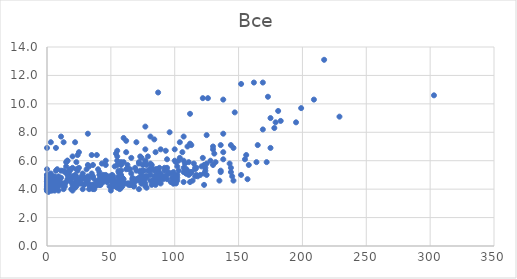
| Category | Цена, млн. £ |
|---|---|
| 172.0 | 5.9 |
| 158.0 | 5.7 |
| 157.0 | 4.7 |
| 152.0 | 5 |
| 146.0 | 4.6 |
| 145.0 | 4.9 |
| 144.0 | 5.5 |
| 136.0 | 5.3 |
| 135.0 | 4.6 |
| 125.0 | 5 |
| 124.0 | 5.3 |
| 123.0 | 4.3 |
| 123.0 | 5.1 |
| 112.0 | 4.5 |
| 99.0 | 4.4 |
| 88.0 | 4.9 |
| 73.0 | 4.6 |
| 72.0 | 4 |
| 67.0 | 4.7 |
| 64.0 | 4.4 |
| 59.0 | 4.2 |
| 57.0 | 4 |
| 53.0 | 4.5 |
| 52.0 | 4.4 |
| 47.0 | 4.5 |
| 36.0 | 4 |
| 33.0 | 4.3 |
| 19.0 | 4.8 |
| 11.0 | 4.8 |
| 10.0 | 4.5 |
| 9.0 | 4.2 |
| 9.0 | 4.3 |
| 8.0 | 4.7 |
| 7.0 | 4.7 |
| 5.0 | 4.2 |
| 4.0 | 4.2 |
| 3.0 | 4.8 |
| 1.0 | 4 |
| 0.0 | 5 |
| 0.0 | 4.7 |
| 0.0 | 4.4 |
| 0.0 | 4.2 |
| 0.0 | 4.2 |
| 0.0 | 4.1 |
| 0.0 | 4 |
| 0.0 | 4 |
| 0.0 | 4 |
| 0.0 | 4 |
| 0.0 | 4 |
| 0.0 | 4 |
| 0.0 | 4 |
| 0.0 | 4 |
| 0.0 | 4 |
| 0.0 | 4 |
| 0.0 | 4 |
| 0.0 | 4 |
| 0.0 | 4 |
| 0.0 | 3.9 |
| 0.0 | 3.9 |
| 0.0 | 3.9 |
| 0.0 | 3.9 |
| 0.0 | 3.9 |
| 175.0 | 6.9 |
| 165.0 | 7.1 |
| 156.0 | 6.4 |
| 146.0 | 6.9 |
| 143.0 | 5.8 |
| 138.0 | 6.1 |
| 138.0 | 6.6 |
| 132.0 | 5.9 |
| 131.0 | 6.5 |
| 130.0 | 5.7 |
| 123.0 | 5.7 |
| 118.0 | 4.9 |
| 117.0 | 5.5 |
| 116.0 | 4.9 |
| 116.0 | 5.5 |
| 115.0 | 5.8 |
| 114.0 | 4.6 |
| 113.0 | 5.2 |
| 112.0 | 5.1 |
| 111.0 | 5 |
| 110.0 | 5.3 |
| 109.0 | 5.4 |
| 108.0 | 5.8 |
| 107.0 | 4.5 |
| 107.0 | 6 |
| 103.0 | 5.3 |
| 102.0 | 4.6 |
| 102.0 | 4.8 |
| 102.0 | 5 |
| 101.0 | 4.6 |
| 101.0 | 4.6 |
| 100.0 | 4.6 |
| 100.0 | 5 |
| 100.0 | 6 |
| 99.0 | 4.4 |
| 97.0 | 4.5 |
| 95.0 | 5.2 |
| 94.0 | 4.7 |
| 90.0 | 4.9 |
| 90.0 | 4.9 |
| 89.0 | 4.4 |
| 89.0 | 5 |
| 88.0 | 4.5 |
| 87.0 | 4.8 |
| 87.0 | 5.4 |
| 86.0 | 4.5 |
| 86.0 | 5 |
| 85.0 | 4.5 |
| 85.0 | 4.7 |
| 84.0 | 4.5 |
| 83.0 | 4.4 |
| 83.0 | 4.6 |
| 82.0 | 5.7 |
| 81.0 | 4.6 |
| 81.0 | 5.3 |
| 81.0 | 5.4 |
| 79.0 | 5.3 |
| 78.0 | 4.1 |
| 78.0 | 4.9 |
| 78.0 | 5.7 |
| 77.0 | 4.2 |
| 77.0 | 5.9 |
| 77.0 | 6 |
| 76.0 | 4.6 |
| 74.0 | 4.4 |
| 74.0 | 5 |
| 74.0 | 6.2 |
| 72.0 | 4.8 |
| 71.0 | 4.7 |
| 70.0 | 4.7 |
| 70.0 | 5.3 |
| 68.0 | 4.2 |
| 68.0 | 4.4 |
| 67.0 | 4.8 |
| 66.0 | 4.3 |
| 65.0 | 4.3 |
| 65.0 | 4.4 |
| 64.0 | 4.3 |
| 63.0 | 4.4 |
| 61.0 | 4.4 |
| 60.0 | 4.4 |
| 60.0 | 4.7 |
| 60.0 | 5.9 |
| 59.0 | 4.8 |
| 58.0 | 4.1 |
| 58.0 | 4.5 |
| 58.0 | 5.9 |
| 57.0 | 4.1 |
| 57.0 | 4.7 |
| 56.0 | 4.3 |
| 56.0 | 4.8 |
| 56.0 | 5.2 |
| 55.0 | 4.1 |
| 55.0 | 4.3 |
| 55.0 | 6 |
| 52.0 | 4.2 |
| 52.0 | 4.3 |
| 51.0 | 4.5 |
| 50.0 | 3.9 |
| 50.0 | 4.7 |
| 50.0 | 4.7 |
| 49.0 | 4.2 |
| 48.0 | 4.8 |
| 47.0 | 4.9 |
| 43.0 | 5.8 |
| 42.0 | 4.3 |
| 42.0 | 4.8 |
| 41.0 | 4.3 |
| 41.0 | 4.4 |
| 41.0 | 4.5 |
| 41.0 | 4.7 |
| 39.0 | 4.4 |
| 39.0 | 6.4 |
| 38.0 | 4.2 |
| 37.0 | 4 |
| 36.0 | 4.3 |
| 35.0 | 5.1 |
| 34.0 | 4.1 |
| 33.0 | 4 |
| 33.0 | 4.3 |
| 32.0 | 4.6 |
| 32.0 | 5.7 |
| 30.0 | 4.4 |
| 28.0 | 4 |
| 28.0 | 4.9 |
| 28.0 | 5.1 |
| 27.0 | 4.4 |
| 27.0 | 4.9 |
| 24.0 | 6.4 |
| 23.0 | 4.2 |
| 23.0 | 4.6 |
| 23.0 | 4.7 |
| 23.0 | 5.4 |
| 22.0 | 4.1 |
| 22.0 | 4.3 |
| 22.0 | 5 |
| 20.0 | 3.9 |
| 20.0 | 4.4 |
| 20.0 | 4.9 |
| 20.0 | 6.3 |
| 19.0 | 4 |
| 19.0 | 4.5 |
| 16.0 | 4.7 |
| 14.0 | 4.2 |
| 14.0 | 4.4 |
| 14.0 | 5.2 |
| 13.0 | 4 |
| 9.0 | 3.9 |
| 8.0 | 4.5 |
| 7.0 | 4 |
| 7.0 | 4.2 |
| 7.0 | 4.2 |
| 7.0 | 5.3 |
| 6.0 | 3.9 |
| 6.0 | 4 |
| 6.0 | 4.3 |
| 5.0 | 4.1 |
| 5.0 | 4.2 |
| 5.0 | 4.3 |
| 4.0 | 3.9 |
| 4.0 | 4.2 |
| 3.0 | 3.9 |
| 3.0 | 4.2 |
| 3.0 | 4.9 |
| 2.0 | 4.1 |
| 1.0 | 3.8 |
| 1.0 | 3.9 |
| 1.0 | 4 |
| 1.0 | 4.2 |
| 1.0 | 4.2 |
| 1.0 | 4.2 |
| 1.0 | 4.5 |
| 0.0 | 4.8 |
| 0.0 | 4.5 |
| 0.0 | 4.5 |
| 0.0 | 4.2 |
| 0.0 | 4.2 |
| 0.0 | 4 |
| 0.0 | 4 |
| 0.0 | 4 |
| 0.0 | 4 |
| 0.0 | 4 |
| 0.0 | 4 |
| 0.0 | 4 |
| 0.0 | 4 |
| 0.0 | 4 |
| 0.0 | 4 |
| 0.0 | 4 |
| 0.0 | 3.9 |
| 0.0 | 3.9 |
| 303.0 | 10.6 |
| 229.0 | 9.1 |
| 209.0 | 10.3 |
| 199.0 | 9.7 |
| 195.0 | 8.7 |
| 179.0 | 8.7 |
| 178.0 | 8.3 |
| 175.0 | 9 |
| 173.0 | 10.5 |
| 169.0 | 8.2 |
| 164.0 | 5.9 |
| 155.0 | 6.1 |
| 152.0 | 11.4 |
| 147.0 | 9.4 |
| 144.0 | 5.2 |
| 144.0 | 7.1 |
| 138.0 | 7.9 |
| 136.0 | 5.2 |
| 136.0 | 7.1 |
| 130.0 | 6.8 |
| 130.0 | 7 |
| 128.0 | 6 |
| 125.0 | 5.8 |
| 125.0 | 7.8 |
| 122.0 | 6.2 |
| 121.0 | 5.6 |
| 120.0 | 5 |
| 117.0 | 5 |
| 116.0 | 5.4 |
| 113.0 | 5.2 |
| 112.0 | 7.2 |
| 112.0 | 9.3 |
| 109.0 | 5.1 |
| 109.0 | 5.1 |
| 107.0 | 5.2 |
| 107.0 | 5.5 |
| 107.0 | 7.7 |
| 106.0 | 6.6 |
| 101.0 | 4.4 |
| 101.0 | 4.9 |
| 101.0 | 5.9 |
| 100.0 | 4.5 |
| 100.0 | 6.8 |
| 98.0 | 4.8 |
| 97.0 | 5.1 |
| 96.0 | 8 |
| 94.0 | 5.5 |
| 92.0 | 4.9 |
| 91.0 | 4.7 |
| 89.0 | 4.8 |
| 89.0 | 5.1 |
| 89.0 | 6.8 |
| 88.0 | 5.5 |
| 87.0 | 4.5 |
| 87.0 | 4.8 |
| 87.0 | 5.3 |
| 86.0 | 5 |
| 85.0 | 4.3 |
| 85.0 | 4.6 |
| 85.0 | 4.7 |
| 85.0 | 5.4 |
| 85.0 | 6.6 |
| 84.0 | 4.9 |
| 84.0 | 5.3 |
| 82.0 | 4.3 |
| 82.0 | 5.4 |
| 82.0 | 5.5 |
| 81.0 | 5 |
| 81.0 | 5.4 |
| 81.0 | 5.8 |
| 81.0 | 7.7 |
| 80.0 | 5.3 |
| 78.0 | 4.8 |
| 78.0 | 4.9 |
| 77.0 | 4.4 |
| 77.0 | 4.9 |
| 77.0 | 6.8 |
| 75.0 | 4.7 |
| 75.0 | 5.3 |
| 75.0 | 5.7 |
| 74.0 | 4.4 |
| 74.0 | 4.8 |
| 73.0 | 4.6 |
| 73.0 | 5.2 |
| 73.0 | 5.3 |
| 72.0 | 5.9 |
| 71.0 | 4.7 |
| 70.0 | 4.6 |
| 68.0 | 4.2 |
| 67.0 | 4.7 |
| 66.0 | 5.1 |
| 65.0 | 5.4 |
| 64.0 | 5.4 |
| 62.0 | 5.4 |
| 62.0 | 6.6 |
| 62.0 | 7.4 |
| 59.0 | 4.8 |
| 58.0 | 4.3 |
| 58.0 | 4.7 |
| 58.0 | 4.8 |
| 58.0 | 5 |
| 58.0 | 5.3 |
| 58.0 | 5.7 |
| 56.0 | 4.4 |
| 56.0 | 4.9 |
| 56.0 | 5.3 |
| 55.0 | 4.5 |
| 55.0 | 5.7 |
| 55.0 | 6.3 |
| 54.0 | 4.2 |
| 53.0 | 4.4 |
| 53.0 | 4.6 |
| 52.0 | 4.7 |
| 52.0 | 4.9 |
| 51.0 | 4.2 |
| 51.0 | 4.5 |
| 51.0 | 4.8 |
| 51.0 | 5 |
| 49.0 | 4.9 |
| 48.0 | 4.8 |
| 47.0 | 4.7 |
| 46.0 | 5 |
| 46.0 | 5.7 |
| 46.0 | 6 |
| 45.0 | 4.7 |
| 44.0 | 5 |
| 41.0 | 4.3 |
| 41.0 | 4.4 |
| 41.0 | 5 |
| 41.0 | 5.2 |
| 40.0 | 5.4 |
| 39.0 | 4.3 |
| 36.0 | 4.8 |
| 35.0 | 4.3 |
| 35.0 | 6.4 |
| 32.0 | 4.7 |
| 32.0 | 4.8 |
| 31.0 | 4.8 |
| 31.0 | 5.4 |
| 30.0 | 4.7 |
| 29.0 | 4.3 |
| 28.0 | 4.8 |
| 27.0 | 4.7 |
| 26.0 | 4.4 |
| 25.0 | 4.4 |
| 25.0 | 4.5 |
| 25.0 | 5.5 |
| 24.0 | 4.7 |
| 23.0 | 4.3 |
| 23.0 | 4.4 |
| 23.0 | 4.9 |
| 23.0 | 5.9 |
| 22.0 | 4.2 |
| 22.0 | 4.4 |
| 21.0 | 4.2 |
| 20.0 | 4.3 |
| 18.0 | 5.3 |
| 17.0 | 5.1 |
| 16.0 | 5 |
| 16.0 | 5.2 |
| 16.0 | 6 |
| 15.0 | 4.5 |
| 15.0 | 5.6 |
| 13.0 | 4.2 |
| 13.0 | 4.3 |
| 13.0 | 4.4 |
| 13.0 | 5.3 |
| 13.0 | 7.3 |
| 11.0 | 4.4 |
| 11.0 | 5.3 |
| 11.0 | 7.7 |
| 10.0 | 4.4 |
| 10.0 | 4.7 |
| 10.0 | 4.7 |
| 8.0 | 4.2 |
| 8.0 | 4.3 |
| 8.0 | 4.7 |
| 7.0 | 4.5 |
| 7.0 | 6.9 |
| 6.0 | 4.8 |
| 6.0 | 4.9 |
| 5.0 | 4.5 |
| 5.0 | 4.7 |
| 5.0 | 4.7 |
| 4.0 | 4.2 |
| 4.0 | 4.2 |
| 4.0 | 4.5 |
| 3.0 | 4.5 |
| 3.0 | 4.5 |
| 3.0 | 5.1 |
| 3.0 | 7.3 |
| 2.0 | 4.5 |
| 2.0 | 4.5 |
| 1.0 | 4.2 |
| 1.0 | 4.4 |
| 1.0 | 4.5 |
| 1.0 | 4.5 |
| 1.0 | 4.5 |
| 1.0 | 4.8 |
| 0.0 | 6.9 |
| 0.0 | 5 |
| 0.0 | 4.8 |
| 0.0 | 4.7 |
| 0.0 | 4.5 |
| 0.0 | 4.5 |
| 0.0 | 4.5 |
| 0.0 | 4.5 |
| 0.0 | 4.5 |
| 0.0 | 4.5 |
| 0.0 | 4.5 |
| 0.0 | 4.5 |
| 0.0 | 4.5 |
| 0.0 | 4.5 |
| 0.0 | 4.5 |
| 0.0 | 4.5 |
| 0.0 | 4.5 |
| 0.0 | 4.5 |
| 0.0 | 4.5 |
| 0.0 | 4.4 |
| 0.0 | 4.4 |
| 0.0 | 4.4 |
| 0.0 | 4.3 |
| 0.0 | 4.3 |
| 0.0 | 4.2 |
| 217.0 | 13.1 |
| 183.0 | 8.8 |
| 181.0 | 9.5 |
| 169.0 | 11.5 |
| 162.0 | 11.5 |
| 138.0 | 10.3 |
| 126.0 | 10.4 |
| 124.0 | 5.5 |
| 122.0 | 10.4 |
| 113.0 | 7.1 |
| 111.0 | 5.9 |
| 110.0 | 7 |
| 109.0 | 5.4 |
| 108.0 | 5.4 |
| 104.0 | 6.2 |
| 104.0 | 7.3 |
| 103.0 | 6 |
| 102.0 | 5.6 |
| 99.0 | 5.2 |
| 94.0 | 5 |
| 94.0 | 6.1 |
| 93.0 | 6.7 |
| 92.0 | 5.3 |
| 92.0 | 5.5 |
| 88.0 | 4.9 |
| 87.0 | 10.8 |
| 86.0 | 5.4 |
| 84.0 | 7.5 |
| 83.0 | 4.6 |
| 79.0 | 6.3 |
| 77.0 | 8.4 |
| 76.0 | 5.3 |
| 73.0 | 4.8 |
| 73.0 | 6.3 |
| 72.0 | 5.8 |
| 70.0 | 7.3 |
| 69.0 | 5.5 |
| 66.0 | 6.2 |
| 63.0 | 5.7 |
| 60.0 | 7.6 |
| 55.0 | 6.7 |
| 54.0 | 6.5 |
| 53.0 | 5.6 |
| 44.0 | 4.5 |
| 43.0 | 4.6 |
| 38.0 | 4.6 |
| 36.0 | 4.9 |
| 36.0 | 5.7 |
| 33.0 | 5.6 |
| 32.0 | 4.9 |
| 32.0 | 7.9 |
| 25.0 | 6.6 |
| 24.0 | 5.3 |
| 22.0 | 7.3 |
| 21.0 | 4.9 |
| 20.0 | 4.8 |
| 20.0 | 5.5 |
| 18.0 | 5.4 |
| 16.0 | 6 |
| 15.0 | 5.9 |
| 9.0 | 4.9 |
| 8.0 | 5.4 |
| 4.0 | 4.5 |
| 4.0 | 4.9 |
| 3.0 | 4.9 |
| 3.0 | 5 |
| 2.0 | 4.5 |
| 2.0 | 4.9 |
| 1.0 | 4.5 |
| 1.0 | 4.5 |
| 0.0 | 5.4 |
| 0.0 | 4.5 |
| 0.0 | 4.5 |
| 0.0 | 4.5 |